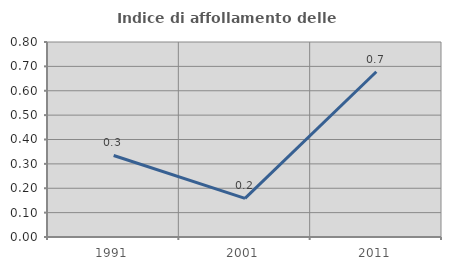
| Category | Indice di affollamento delle abitazioni  |
|---|---|
| 1991.0 | 0.334 |
| 2001.0 | 0.158 |
| 2011.0 | 0.678 |